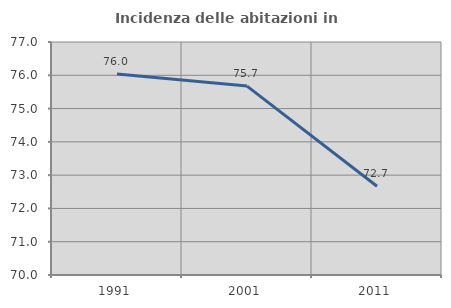
| Category | Incidenza delle abitazioni in proprietà  |
|---|---|
| 1991.0 | 76.037 |
| 2001.0 | 75.676 |
| 2011.0 | 72.666 |